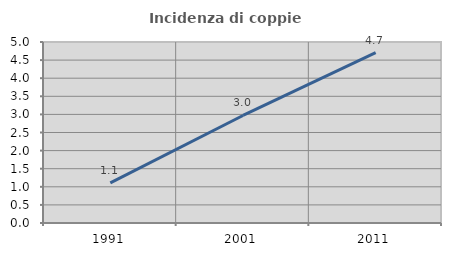
| Category | Incidenza di coppie miste |
|---|---|
| 1991.0 | 1.107 |
| 2001.0 | 2.97 |
| 2011.0 | 4.706 |